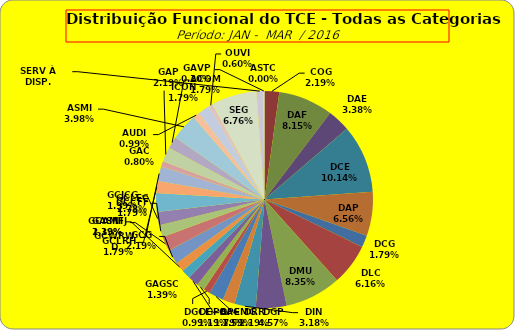
| Category | ASTC COG DAF DAE DCE DAP DCG DLC DMU DGP DIN DPE DRR DGCE DGPA GACMG GAGSC GASNI GCG GCAMFJ GCCFF GCJCG GCLEC GCLRH GCWRWD GAC GAP ACOM ASMI AUDI ICON OUVI SEG SERV À DISP. GAVP |
|---|---|
| ASTC | 0 |
| COG | 11 |
| DAF | 41 |
| DAE | 17 |
| DCE | 51 |
| DAP | 33 |
| DCG | 9 |
| DLC | 31 |
| DMU | 42 |
| DGP | 23 |
| DIN | 16 |
| DPE | 9 |
| DRR | 11 |
| DGCE | 5 |
| DGPA | 6 |
| GACMG | 8 |
| GAGSC | 7 |
| GASNI | 7 |
| GCG | 11 |
| GCAMFJ | 11 |
| GCCFF | 9 |
| GCJCG | 10 |
| GCLEC | 14 |
| GCLRH | 9 |
| GCWRWD | 11 |
| GAC | 4 |
| GAP | 11 |
| ACOM | 9 |
| ASMI | 20 |
| AUDI | 5 |
| ICON | 9 |
| OUVI | 3 |
| SEG | 34 |
| SERV À DISP. | 5 |
| GAVP | 1 |